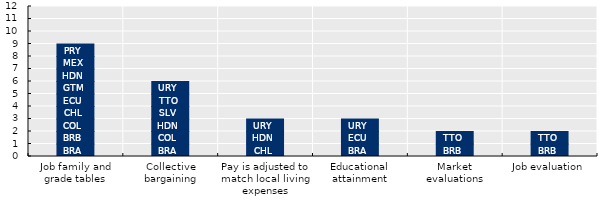
| Category | BRA | BRB | COL | CHL | ECU | GTM | HDN | MEX | PRY | SLV | TTO | URY |
|---|---|---|---|---|---|---|---|---|---|---|---|---|
| Job family and grade tables | 1 | 1 | 1 | 1 | 1 | 1 | 1 | 1 | 1 | 0 | 0 | 0 |
| Collective bargaining | 1 | 0 | 1 | 0 | 0 | 0 | 1 | 0 | 0 | 1 | 1 | 1 |
| Pay is adjusted to match local living expenses | 0 | 0 | 0 | 1 | 0 | 0 | 1 | 0 | 0 | 0 | 0 | 1 |
| Educational attainment | 1 | 0 | 0 | 0 | 1 | 0 | 0 | 0 | 0 | 0 | 0 | 1 |
| Market evaluations | 0 | 1 | 0 | 0 | 0 | 0 | 0 | 0 | 0 | 0 | 1 | 0 |
| Job evaluation | 0 | 1 | 0 | 0 | 0 | 0 | 0 | 0 | 0 | 0 | 1 | 0 |